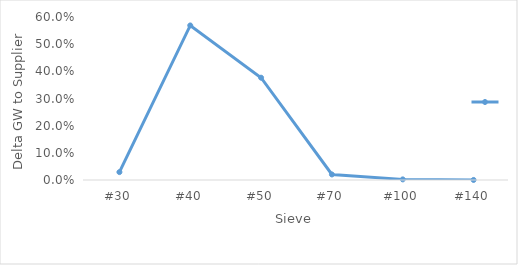
| Category | Series 0 |
|---|---|
| #30 | 0.029 |
| #40 | 0.569 |
| #50 | 0.377 |
| #70 | 0.02 |
| #100 | 0.002 |
| #140 | 0 |